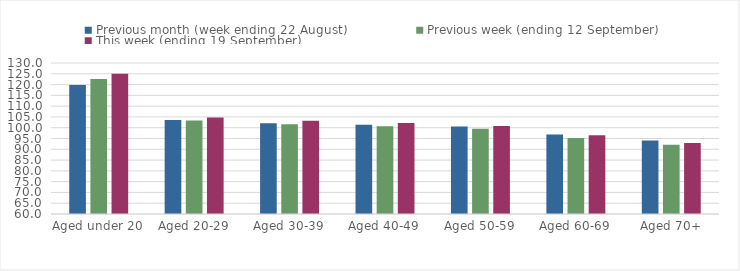
| Category | Previous month (week ending 22 August) | Previous week (ending 12 September) | This week (ending 19 September) |
|---|---|---|---|
| Aged under 20 | 119.8 | 122.64 | 125.07 |
| Aged 20-29 | 103.56 | 103.4 | 104.73 |
| Aged 30-39 | 102.1 | 101.57 | 103.18 |
| Aged 40-49 | 101.4 | 100.73 | 102.18 |
| Aged 50-59 | 100.52 | 99.52 | 100.79 |
| Aged 60-69 | 96.82 | 95.28 | 96.45 |
| Aged 70+ | 94.1 | 92.09 | 92.94 |